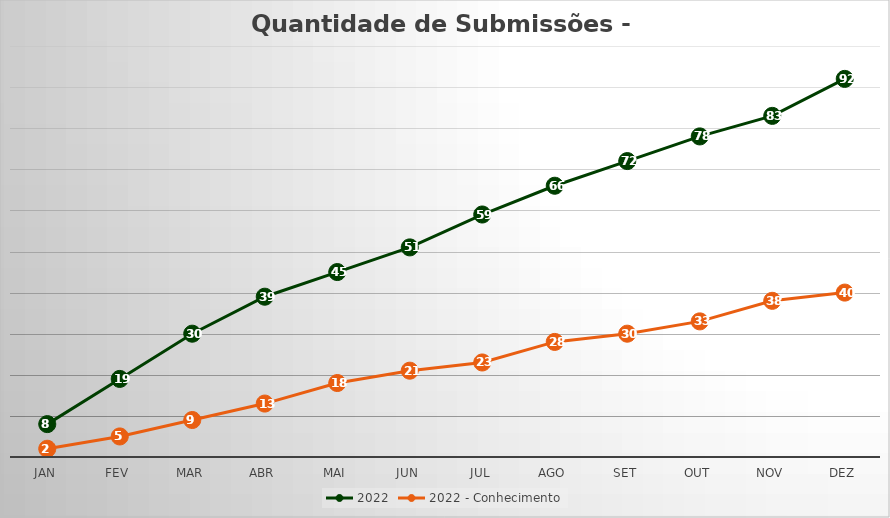
| Category | 2022 | 2022 - Conhecimento |
|---|---|---|
| Jan | 8 | 2 |
| Fev | 19 | 5 |
| Mar | 30 | 9 |
| Abr | 39 | 13 |
| Mai | 45 | 18 |
| Jun | 51 | 21 |
| Jul | 59 | 23 |
| Ago | 66 | 28 |
| Set | 72 | 30 |
| Out | 78 | 33 |
| Nov | 83 | 38 |
| Dez | 92 | 40 |